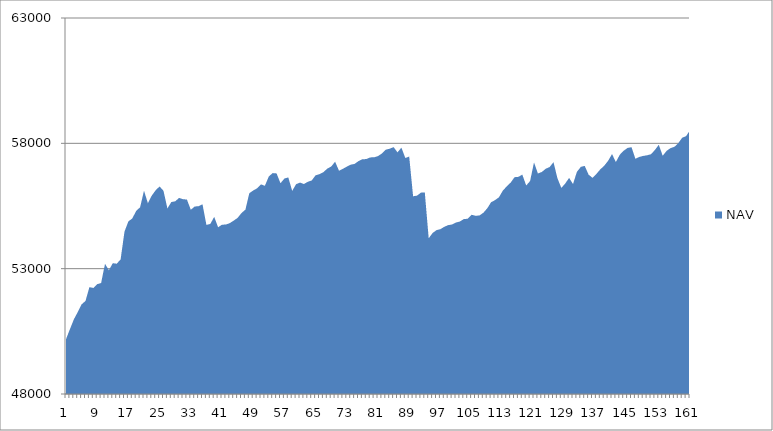
| Category | NAV |
|---|---|
| 0 | 50185.185 |
| 1 | 50585.185 |
| 2 | 50973.977 |
| 3 | 51265.977 |
| 4 | 51576.741 |
| 5 | 51711.523 |
| 6 | 52262.893 |
| 7 | 52230.24 |
| 8 | 52381.556 |
| 9 | 52425.915 |
| 10 | 53192.581 |
| 11 | 52939.146 |
| 12 | 53220.069 |
| 13 | 53197.341 |
| 14 | 53369.61 |
| 15 | 54480.721 |
| 16 | 54888.365 |
| 17 | 55001.902 |
| 18 | 55308.308 |
| 19 | 55448.308 |
| 20 | 56110.305 |
| 21 | 55610.305 |
| 22 | 55916.954 |
| 23 | 56129.798 |
| 24 | 56279.798 |
| 25 | 56105.301 |
| 26 | 55401.645 |
| 27 | 55657.201 |
| 28 | 55686.925 |
| 29 | 55823.001 |
| 30 | 55769.596 |
| 31 | 55759.375 |
| 32 | 55350.284 |
| 33 | 55480.284 |
| 34 | 55492.498 |
| 35 | 55570.42 |
| 36 | 54746.89 |
| 37 | 54783.7 |
| 38 | 55066.459 |
| 39 | 54651.074 |
| 40 | 54754.078 |
| 41 | 54760.213 |
| 42 | 54816.924 |
| 43 | 54917.296 |
| 44 | 55025.73 |
| 45 | 55220.535 |
| 46 | 55353.465 |
| 47 | 56009.309 |
| 48 | 56118.959 |
| 49 | 56205.212 |
| 50 | 56362.876 |
| 51 | 56307.394 |
| 52 | 56678.935 |
| 53 | 56813.264 |
| 54 | 56799.502 |
| 55 | 56409.112 |
| 56 | 56596.44 |
| 57 | 56640.493 |
| 58 | 56102.227 |
| 59 | 56370.449 |
| 60 | 56434.248 |
| 61 | 56376.841 |
| 62 | 56464.524 |
| 63 | 56518.022 |
| 64 | 56724.747 |
| 65 | 56770.361 |
| 66 | 56848.099 |
| 67 | 56992.896 |
| 68 | 57073.571 |
| 69 | 57266.481 |
| 70 | 56908.016 |
| 71 | 56984.939 |
| 72 | 57069.276 |
| 73 | 57147.627 |
| 74 | 57179.83 |
| 75 | 57291.17 |
| 76 | 57366.35 |
| 77 | 57371.599 |
| 78 | 57439.215 |
| 79 | 57440.895 |
| 80 | 57490.895 |
| 81 | 57593.679 |
| 82 | 57746.643 |
| 83 | 57785.413 |
| 84 | 57849.748 |
| 85 | 57639.346 |
| 86 | 57828.82 |
| 87 | 57417.055 |
| 88 | 57471.335 |
| 89 | 55888.376 |
| 90 | 55913.907 |
| 91 | 56031.989 |
| 92 | 56044.711 |
| 93 | 54210.631 |
| 94 | 54422.612 |
| 95 | 54536.647 |
| 96 | 54575.903 |
| 97 | 54670.229 |
| 98 | 54737.367 |
| 99 | 54762.386 |
| 100 | 54842.923 |
| 101 | 54881.385 |
| 102 | 54978.816 |
| 103 | 54991.283 |
| 104 | 55149.699 |
| 105 | 55109.498 |
| 106 | 55121.656 |
| 107 | 55227.569 |
| 108 | 55405.15 |
| 109 | 55650.183 |
| 110 | 55733.424 |
| 111 | 55846.244 |
| 112 | 56110.95 |
| 113 | 56283.172 |
| 114 | 56430.541 |
| 115 | 56648.489 |
| 116 | 56663.919 |
| 117 | 56752.272 |
| 118 | 56318.108 |
| 119 | 56496.442 |
| 120 | 57240.145 |
| 121 | 56797.081 |
| 122 | 56857.303 |
| 123 | 56985.874 |
| 124 | 57053.805 |
| 125 | 57249.117 |
| 126 | 56612.311 |
| 127 | 56221.507 |
| 128 | 56394.346 |
| 129 | 56622.008 |
| 130 | 56375.255 |
| 131 | 56862.384 |
| 132 | 57060.137 |
| 133 | 57099.524 |
| 134 | 56750.37 |
| 135 | 56622.71 |
| 136 | 56780.605 |
| 137 | 56961.84 |
| 138 | 57105.4 |
| 139 | 57301.96 |
| 140 | 57570.545 |
| 141 | 57256.886 |
| 142 | 57545.679 |
| 143 | 57705.679 |
| 144 | 57817.679 |
| 145 | 57845.512 |
| 146 | 57383.973 |
| 147 | 57457.609 |
| 148 | 57498.333 |
| 149 | 57523.57 |
| 150 | 57565.004 |
| 151 | 57735.592 |
| 152 | 57941.474 |
| 153 | 57502.813 |
| 154 | 57699.914 |
| 155 | 57809.005 |
| 156 | 57860.434 |
| 157 | 58009.271 |
| 158 | 58224.271 |
| 159 | 58286.771 |
| 160 | 58524.271 |